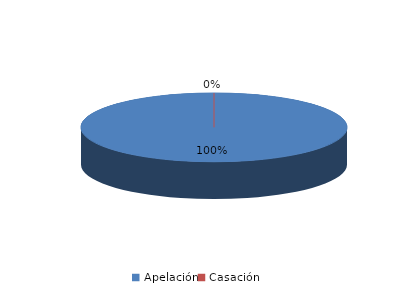
| Category | Series 0 |
|---|---|
| Apelación | 19 |
| Casación | 0 |